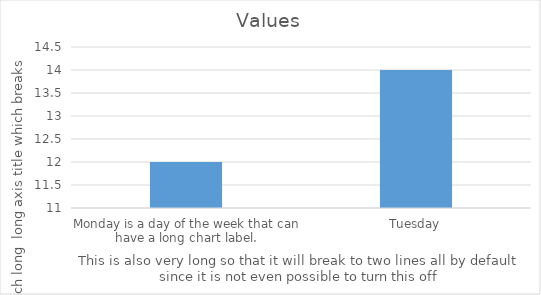
| Category | Values |
|---|---|
| Monday is a day of the week that can have a long chart label. | 12 |
| Tuesday | 14 |